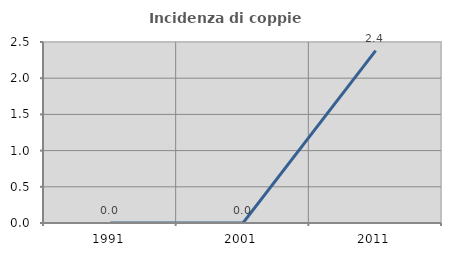
| Category | Incidenza di coppie miste |
|---|---|
| 1991.0 | 0 |
| 2001.0 | 0 |
| 2011.0 | 2.381 |